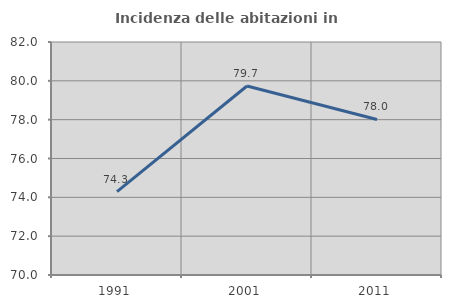
| Category | Incidenza delle abitazioni in proprietà  |
|---|---|
| 1991.0 | 74.293 |
| 2001.0 | 79.733 |
| 2011.0 | 78.01 |